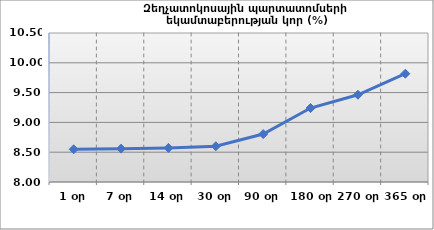
| Category | Series 0 |
|---|---|
| 1 օր | 8.549 |
| 7 օր | 8.559 |
| 14 օր | 8.572 |
| 30 օր | 8.6 |
| 90 օր | 8.804 |
| 180 օր | 9.241 |
| 270 օր | 9.464 |
| 365 օր | 9.817 |